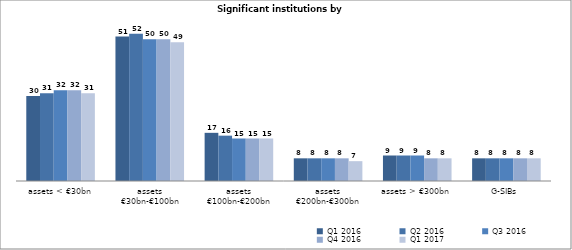
| Category | Q1 2016 | Q2 2016 | Q3 2016 | Q4 2016 | Q1 2017 |
|---|---|---|---|---|---|
| assets < €30bn | 30 | 31 | 32 | 32 | 31 |
| assets
€30bn-€100bn | 51 | 52 | 50 | 50 | 49 |
| assets
€100bn-€200bn | 17 | 16 | 15 | 15 | 15 |
| assets
€200bn-€300bn | 8 | 8 | 8 | 8 | 7 |
| assets > €300bn | 9 | 9 | 9 | 8 | 8 |
| G-SIBs | 8 | 8 | 8 | 8 | 8 |